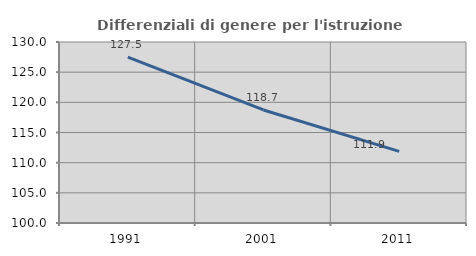
| Category | Differenziali di genere per l'istruzione superiore |
|---|---|
| 1991.0 | 127.496 |
| 2001.0 | 118.736 |
| 2011.0 | 111.871 |